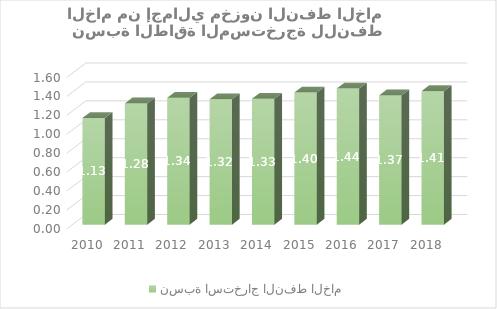
| Category | نسبة استخراج النفط الخام |
|---|---|
| 2010.0 | 1.127 |
| 2011.0 | 1.28 |
| 2012.0 | 1.34 |
| 2013.0 | 1.323 |
| 2014.0 | 1.33 |
| 2015.0 | 1.396 |
| 2016.0 | 1.438 |
| 2017.0 | 1.365 |
| 2018.0 | 1.41 |